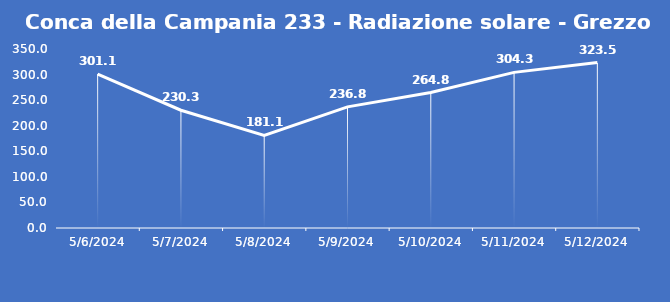
| Category | Conca della Campania 233 - Radiazione solare - Grezzo (W/m2) |
|---|---|
| 5/6/24 | 301.1 |
| 5/7/24 | 230.3 |
| 5/8/24 | 181.1 |
| 5/9/24 | 236.8 |
| 5/10/24 | 264.8 |
| 5/11/24 | 304.3 |
| 5/12/24 | 323.5 |